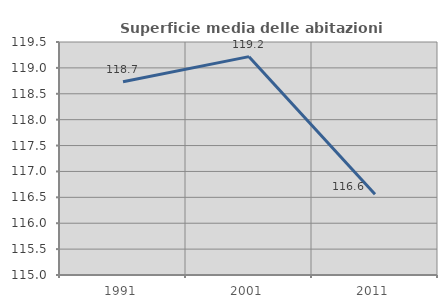
| Category | Superficie media delle abitazioni occupate |
|---|---|
| 1991.0 | 118.731 |
| 2001.0 | 119.217 |
| 2011.0 | 116.558 |